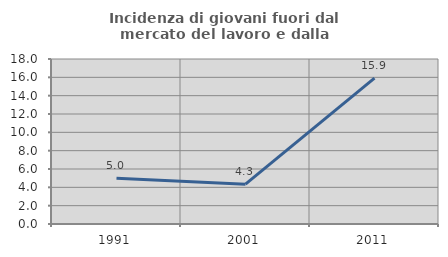
| Category | Incidenza di giovani fuori dal mercato del lavoro e dalla formazione  |
|---|---|
| 1991.0 | 5 |
| 2001.0 | 4.348 |
| 2011.0 | 15.909 |